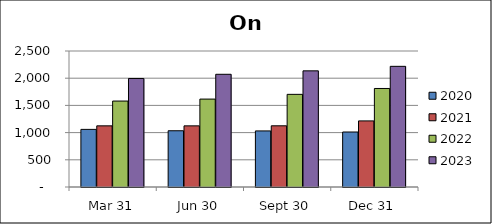
| Category | 2020 | 2021 | 2022 | 2023 |
|---|---|---|---|---|
| Mar 31 | 1059 | 1124 | 1580 | 1995 |
| Jun 30 | 1034 | 1124 | 1616 | 2072 |
| Sept 30 | 1031 | 1125 | 1703 | 2135 |
| Dec 31 | 1011 | 1215 | 1811 | 2218 |